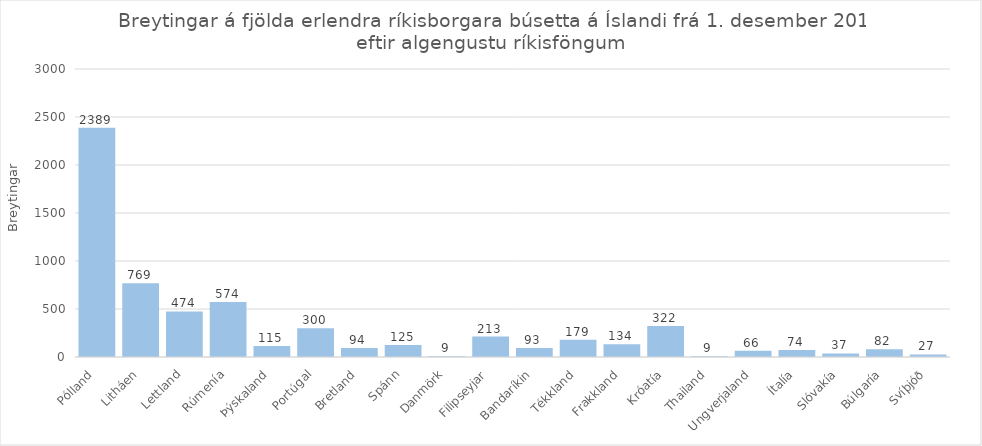
| Category | Series 0 |
|---|---|
| Pólland | 2389 |
| Litháen | 769 |
| Lettland | 474 |
| Rúmenía | 574 |
| Þýskaland | 115 |
| Portúgal | 300 |
| Bretland | 94 |
| Spánn | 125 |
| Danmörk | 9 |
| Filipseyjar | 213 |
| Bandaríkin | 93 |
| Tékkland | 179 |
| Frakkland | 134 |
| Króatía | 322 |
| Thailand | 9 |
| Ungverjaland | 66 |
| Ítalía | 74 |
| Slóvakía | 37 |
| Búlgaría | 82 |
| Svíþjóð | 27 |